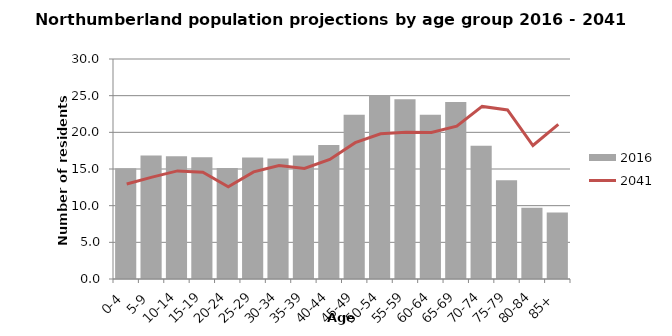
| Category | 2016 |
|---|---|
| 0-4 | 15.098 |
| 5-9 | 16.842 |
| 10-14 | 16.747 |
| 15-19 | 16.611 |
| 20-24 | 15.145 |
| 25-29 | 16.557 |
| 30-34 | 16.448 |
| 35-39 | 16.837 |
| 40-44 | 18.271 |
| 45-49 | 22.387 |
| 50-54 | 25.042 |
| 55-59 | 24.528 |
| 60-64 | 22.402 |
| 65-69 | 24.129 |
| 70-74 | 18.168 |
| 75-79 | 13.453 |
| 80-84 | 9.709 |
| 85+ | 9.07 |